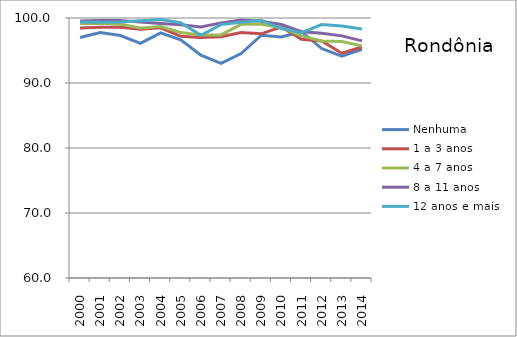
| Category | Nenhuma | 1 a 3 anos | 4 a 7 anos | 8 a 11 anos | 12 anos e mais |
|---|---|---|---|---|---|
| 2000.0 | 97.01 | 98.461 | 99.146 | 99.521 | 99.329 |
| 2001.0 | 97.781 | 98.567 | 99.2 | 99.634 | 99.333 |
| 2002.0 | 97.301 | 98.592 | 99.055 | 99.625 | 99.389 |
| 2003.0 | 96.085 | 98.278 | 98.459 | 99.366 | 99.57 |
| 2004.0 | 97.71 | 98.494 | 98.699 | 99.153 | 99.755 |
| 2005.0 | 96.635 | 97.183 | 97.775 | 98.976 | 99.268 |
| 2006.0 | 94.286 | 97.007 | 97.386 | 98.607 | 97.335 |
| 2007.0 | 93.031 | 97.133 | 97.393 | 99.248 | 98.982 |
| 2008.0 | 94.539 | 97.757 | 99.02 | 99.681 | 99.358 |
| 2009.0 | 97.357 | 97.565 | 99.026 | 99.494 | 99.66 |
| 2010.0 | 97.076 | 98.623 | 98.523 | 99.003 | 98.371 |
| 2011.0 | 97.906 | 96.735 | 97.245 | 97.879 | 97.735 |
| 2012.0 | 95.302 | 96.455 | 96.479 | 97.65 | 98.993 |
| 2013.0 | 94.118 | 94.579 | 96.37 | 97.252 | 98.783 |
| 2014.0 | 95.192 | 95.531 | 95.713 | 96.475 | 98.303 |